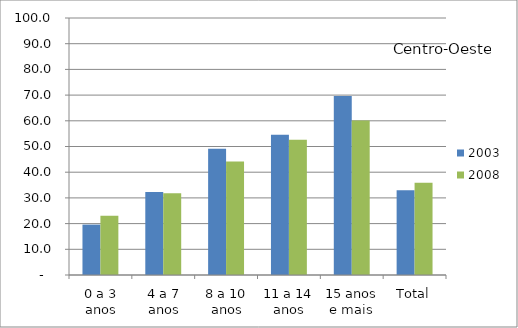
| Category | 2003 | 2008 |
|---|---|---|
| 0 a 3 anos | 19.61 | 23.07 |
| 4 a 7 anos | 32.32 | 31.82 |
| 8 a 10 anos | 49.1 | 44.2 |
| 11 a 14 anos | 54.54 | 52.62 |
| 15 anos e mais | 69.67 | 60.07 |
| Total | 33.01 | 35.86 |